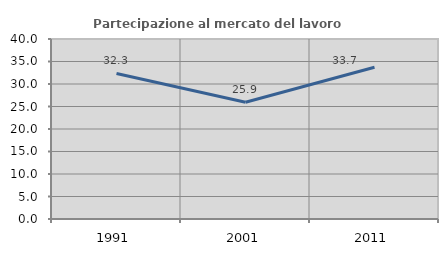
| Category | Partecipazione al mercato del lavoro  femminile |
|---|---|
| 1991.0 | 32.349 |
| 2001.0 | 25.938 |
| 2011.0 | 33.71 |